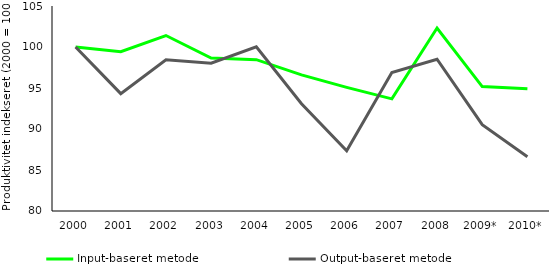
| Category | Input-baseret metode | Output-baseret metode |
|---|---|---|
| 2000 | 100 | 100 |
| 2001 | 99.427 | 94.309 |
| 2002 | 101.401 | 98.444 |
| 2003 | 98.661 | 98.024 |
| 2004 | 98.456 | 100.029 |
| 2005 | 96.594 | 93.086 |
| 2006 | 95.073 | 87.342 |
| 2007 | 93.679 | 96.887 |
| 2008 | 102.318 | 98.507 |
| 2009* | 95.175 | 90.524 |
| 2010* | 94.901 | 86.624 |